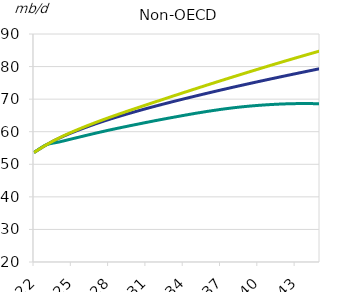
| Category | Reference Case | Advanced Technology | Laissez-Faire |
|---|---|---|---|
| 2022.0 | 53.623 | 53.623 | 53.623 |
| 2023.0 | 55.986 | 55.986 | 55.986 |
| 2024.0 | 57.974 | 56.83 | 58.051 |
| 2025.0 | 59.636 | 57.759 | 59.815 |
| 2026.0 | 61.105 | 58.683 | 61.407 |
| 2027.0 | 62.471 | 59.595 | 62.898 |
| 2028.0 | 63.728 | 60.461 | 64.298 |
| 2029.0 | 64.898 | 61.275 | 65.639 |
| 2030.0 | 66.009 | 62.061 | 66.934 |
| 2031.0 | 67.073 | 62.831 | 68.204 |
| 2032.0 | 68.091 | 63.575 | 69.464 |
| 2033.0 | 69.072 | 64.29 | 70.723 |
| 2034.0 | 70.032 | 64.985 | 71.967 |
| 2035.0 | 70.965 | 65.656 | 73.202 |
| 2036.0 | 71.882 | 66.275 | 74.425 |
| 2037.0 | 72.779 | 66.84 | 75.633 |
| 2038.0 | 73.656 | 67.332 | 76.83 |
| 2039.0 | 74.512 | 67.741 | 78.013 |
| 2040.0 | 75.353 | 68.073 | 79.181 |
| 2041.0 | 76.177 | 68.33 | 80.339 |
| 2042.0 | 76.989 | 68.519 | 81.479 |
| 2043.0 | 77.789 | 68.621 | 82.597 |
| 2044.0 | 78.579 | 68.645 | 83.705 |
| 2045.0 | 79.36 | 68.584 | 84.799 |